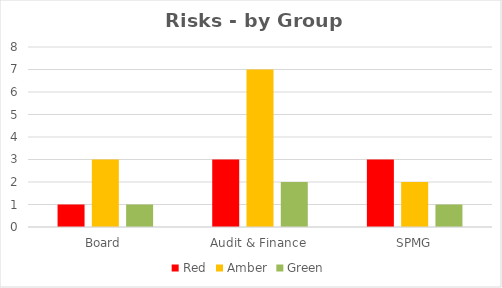
| Category | Red | Amber | Green |
|---|---|---|---|
| Board | 1 | 3 | 1 |
| Audit & Finance | 3 | 7 | 2 |
| SPMG | 3 | 2 | 1 |